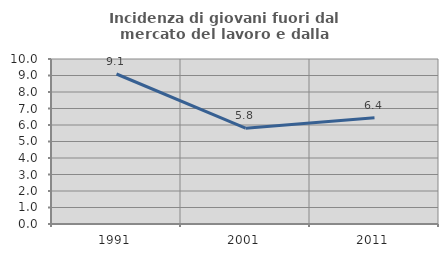
| Category | Incidenza di giovani fuori dal mercato del lavoro e dalla formazione  |
|---|---|
| 1991.0 | 9.091 |
| 2001.0 | 5.805 |
| 2011.0 | 6.444 |